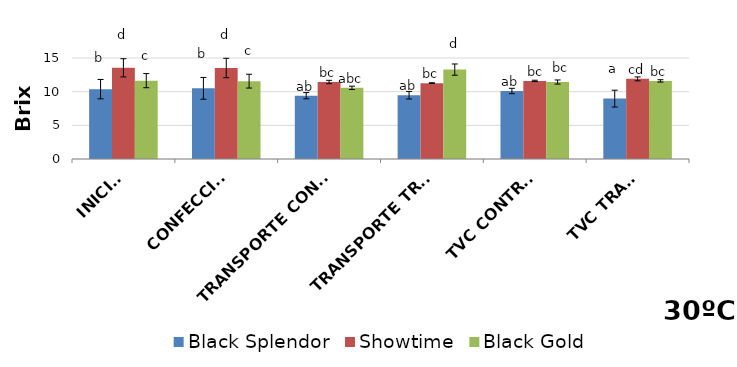
| Category | Black Splendor | Showtime | Black Gold |
|---|---|---|---|
| INICIAL | 10.373 | 13.543 | 11.637 |
| CONFECCIÓN | 10.497 | 13.517 | 11.562 |
|  TRANSPORTE CONTROL | 9.4 | 11.433 | 10.567 |
| TRANSPORTE TRAT. | 9.473 | 11.267 | 13.278 |
| TVC CONTROL | 10.1 | 11.6 | 11.433 |
| TVC TRAT. | 8.967 | 11.9 | 11.6 |